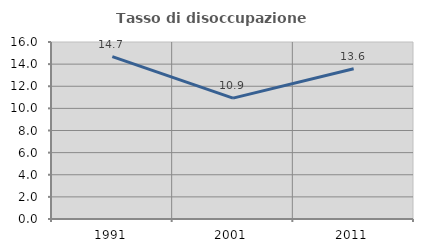
| Category | Tasso di disoccupazione giovanile  |
|---|---|
| 1991.0 | 14.679 |
| 2001.0 | 10.924 |
| 2011.0 | 13.58 |